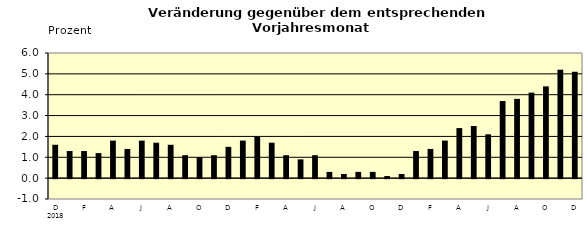
| Category | Series 0 |
|---|---|
| 0 | 1.6 |
| 1 | 1.3 |
| 2 | 1.3 |
| 3 | 1.2 |
| 4 | 1.8 |
| 5 | 1.4 |
| 6 | 1.8 |
| 7 | 1.7 |
| 8 | 1.6 |
| 9 | 1.1 |
| 10 | 1 |
| 11 | 1.1 |
| 12 | 1.5 |
| 13 | 1.8 |
| 14 | 2 |
| 15 | 1.7 |
| 16 | 1.1 |
| 17 | 0.9 |
| 18 | 1.1 |
| 19 | 0.3 |
| 20 | 0.2 |
| 21 | 0.3 |
| 22 | 0.3 |
| 23 | 0.1 |
| 24 | 0.2 |
| 25 | 1.3 |
| 26 | 1.4 |
| 27 | 1.8 |
| 28 | 2.4 |
| 29 | 2.5 |
| 30 | 2.1 |
| 31 | 3.7 |
| 32 | 3.8 |
| 33 | 4.1 |
| 34 | 4.4 |
| 35 | 5.2 |
| 36 | 5.1 |